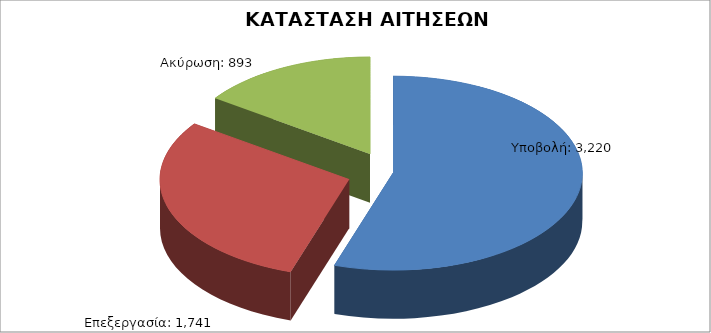
| Category | Series 0 |
|---|---|
| Υποβολή: | 3220 |
| Επεξεργασία: | 1741 |
| Ακύρωση: | 893 |